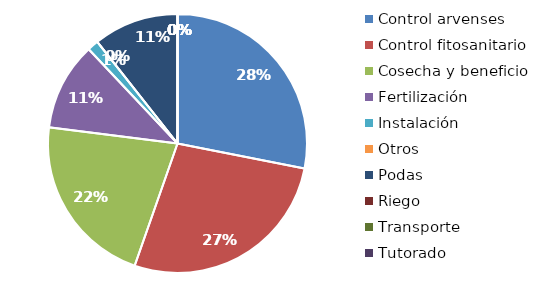
| Category | Valor |
|---|---|
| Control arvenses | 15276000 |
| Control fitosanitario | 14820000 |
| Cosecha y beneficio | 11760457.143 |
| Fertilización | 5966000 |
| Instalación | 760000 |
| Otros | 0 |
| Podas | 5776000 |
| Riego | 0 |
| Transporte | 0 |
| Tutorado | 0 |